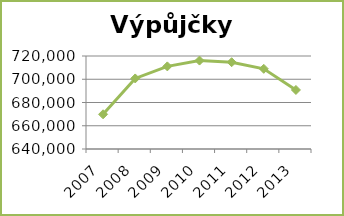
| Category | Výpůjčky celkem |
|---|---|
| 2007.0 | 669839 |
| 2008.0 | 700694 |
| 2009.0 | 711071 |
| 2010.0 | 716066 |
| 2011.0 | 714658 |
| 2012.0 | 708972 |
| 2013.0 | 690789 |